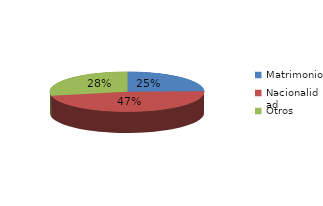
| Category | Series 0 |
|---|---|
| Matrimonio | 447 |
| Nacionalidad | 859 |
| Otros | 514 |